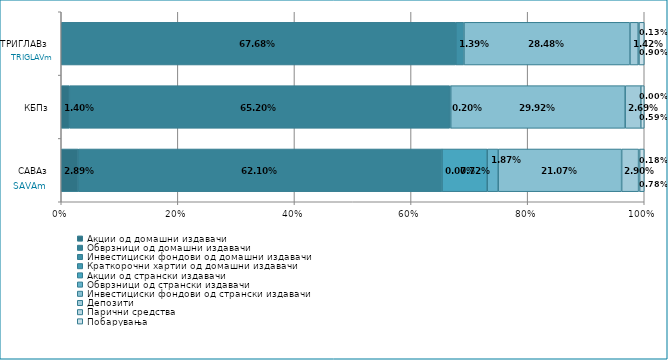
| Category | Акции од домашни издавачи  | Обврзници од домашни издавачи  | Инвестициски фондови од домашни издавачи  | Краткорочни хартии од домашни издавачи  | Акции од странски издавачи  | Обврзници од странски издавачи  | Инвестициски фондови од странски издавaчи | Депозити  | Парични средства  | Побарувања |
|---|---|---|---|---|---|---|---|---|---|---|
| САВАз | 0.029 | 0.621 | 0 | 0 | 0.077 | 0.019 | 0.211 | 0.029 | 0.002 | 0.008 |
| КБПз | 0.014 | 0.652 | 0.002 | 0 | 0 | 0 | 0.299 | 0.027 | 0 | 0.006 |
| ТРИГЛАВз | 0 | 0.677 | 0.014 | 0 | 0 | 0 | 0.285 | 0.014 | 0.001 | 0.009 |